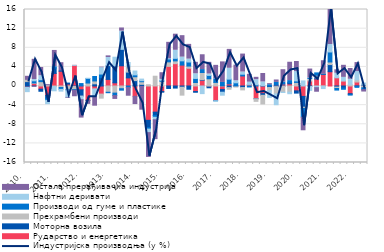
| Category | Рударство и енергетика | Моторна возила | Прехрамбени производи | Производи од гуме и пластике | Нафтни деривати | Остала прерађивачка индустрија |
|---|---|---|---|---|---|---|
| 2010.  | -0.25 | 0.917 | 0.255 | -0.052 | -0.879 | 0.861 |
| II  | 0.533 | -0.006 | 0.112 | 0.442 | 0.263 | 4.234 |
| III | -0.658 | -0.442 | 0.905 | 0.421 | 0.821 | 1.732 |
| IV | -1.977 | -0.557 | 0.067 | -0.479 | -0.692 | 0.217 |
| 2011.  | 2.629 | 1.148 | -0.147 | 0.26 | -0.854 | 3.398 |
| II | 3.096 | 0.115 | -0.324 | -0.379 | -0.372 | 1.665 |
| III | 0.396 | 0.213 | -0.786 | -0.054 | -1.543 | -0.157 |
| IV | 4.311 | -0.093 | -0.663 | -0.13 | 0.016 | -1.363 |
| 2012. | -0.795 | -1.326 | -0.05 | 0.507 | -0.692 | -3.847 |
| II | -2.992 | -0.038 | 0.619 | 0.964 | 0.007 | -0.81 |
| III | -0.594 | 0.455 | 0.596 | 0.935 | -1.603 | -2.027 |
| IV | -1.693 | 1.755 | -0.844 | 0.748 | 1.327 | 0.117 |
| 2013. | 1.379 | 2.888 | -1.307 | -0.096 | 1.688 | 0.348 |
| II | 0.67 | 3.522 | -1.489 | -0.51 | 1.83 | -0.806 |
| III | 4.231 | 3.434 | -0.568 | -0.304 | 3.797 | 0.673 |
| IV | 1.696 | 1.208 | 1.158 | -0.334 | 0.847 | -1.596 |
| 2014. | -2.161 | 1.13 | 0.807 | 0.393 | 0.802 | -1.723 |
| II | -0.11 | 0.347 | 0.545 | 0.211 | 0.344 | -4.95 |
| III | -7.18 | -1.514 | 0.263 | -0.321 | -0.737 | -5.186 |
| IV | -5.474 | -0.682 | 2.045 | -0.385 | -0.515 | -4.159 |
| 2015. | -1.166 | -0.124 | 0.988 | 0.199 | 0.193 | 1.4 |
| II | 4.108 | -0.512 | 0.939 | 0.612 | 0.045 | 3.428 |
| III | 4.672 | -0.433 | 0.58 | 0.533 | 1.685 | 3.367 |
| IV | 4.374 | -0.256 | -1.658 | 0.889 | 0.776 | 4.489 |
| 2016. | 3.704 | -0.676 | 0.466 | 0.847 | 0.604 | 3.087 |
| II | -1.157 | -0.153 | 0.726 | 0.855 | 0.971 | 2.402 |
| III | 1.195 | 0.118 | 1.515 | 0.608 | -1.596 | 3.097 |
| IV | -0.146 | -0.226 | 1.508 | 0.71 | 0.276 | 2.462 |
| 2017. | -3.027 | -0.05 | 0.748 | 0.731 | -0.158 | 2.839 |
| II | -0.719 | -0.58 | 0.035 | 0.706 | -0.624 | 4.3 |
| III | 0.456 | -0.334 | -0.348 | 0.978 | 2.27 | 3.953 |
| IV | -0.07 | 0.021 | -0.156 | 0.647 | 0.422 | 3.284 |
| 2018. | 2.099 | -0.328 | -0.488 | 0.366 | 0.453 | 3.762 |
| II | 0.302 | 0.019 | -0.018 | -0.182 | 0.477 | 1.645 |
| III | -2.651 | -0.029 | -0.529 | 0.253 | 1.076 | 0.486 |
| IV | -1.597 | -0.347 | -1.812 | 0.072 | 0.771 | 1.766 |
| 2019. | -0.079 | -0.235 | -0.646 | 0.265 | -1.418 | 0.224 |
| II | 0.197 | -0.13 | -1.544 | 0.553 | -2.246 | 0.509 |
| III | 0.401 | -0.045 | -1.239 | 0.42 | -0.078 | 2.588 |
| IV | 0.463 | 0.224 | -1.281 | 0.441 | -0.334 | 3.839 |
| 2020. | -1.019 | -0.467 | 0.75 | 0.317 | 1.951 | 2.101 |
| II | -2.182 | -2.255 | -0.246 | -1.832 | 1.059 | -2.852 |
| III | 1.043 | -0.11 | 0.514 | 0.101 | -0.806 | 1.889 |
| IV | 1.474 | 0.245 | 0.531 | 0.493 | -0.344 | -0.959 |
| 2021. | 2.445 | 0.03 | -0.035 | 0.003 | -0.503 | 2.806 |
| II | 2.988 | 1.491 | 0.544 | 2.092 | 1.564 | 7.674 |
| III | 1.715 | -0.231 | -0.289 | -0.332 | 0.949 | 0.73 |
| IV | 1.066 | -0.406 | 0.014 | -0.279 | 0.727 | 2.524 |
| 2022. | -1.6 | -0.217 | 0.296 | -0.066 | 1.111 | 2.253 |
| II | 0.831 | -0.029 | 0.437 | -0.251 | 1.749 | 1.879 |
| III | 0.065 | 0.199 | -0.369 | -0.392 | 0.363 | -0.5 |